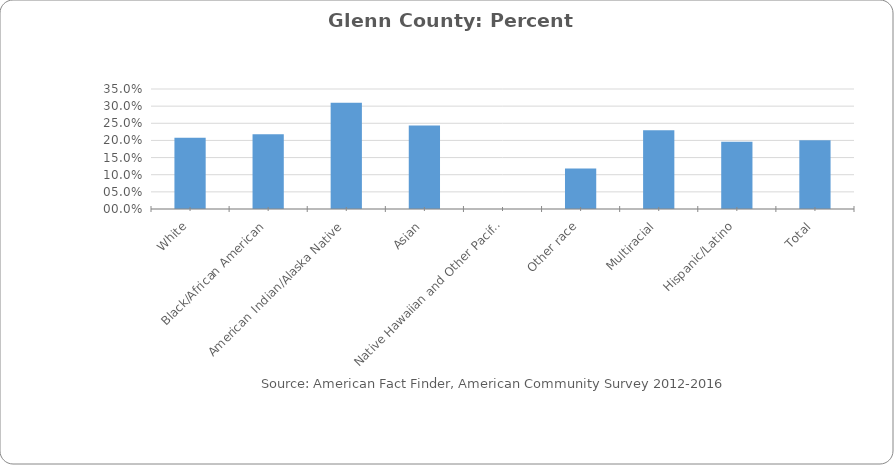
| Category | Percent Population below Poverty Level in Glenn County |
|---|---|
| White | 0.208 |
| Black/African American | 0.218 |
| American Indian/Alaska Native | 0.31 |
| Asian | 0.244 |
|  Native Hawaiian and Other Pacific Islander | 0 |
| Other race | 0.118 |
| Multiracial | 0.23 |
| Hispanic/Latino | 0.196 |
| Total | 0.201 |